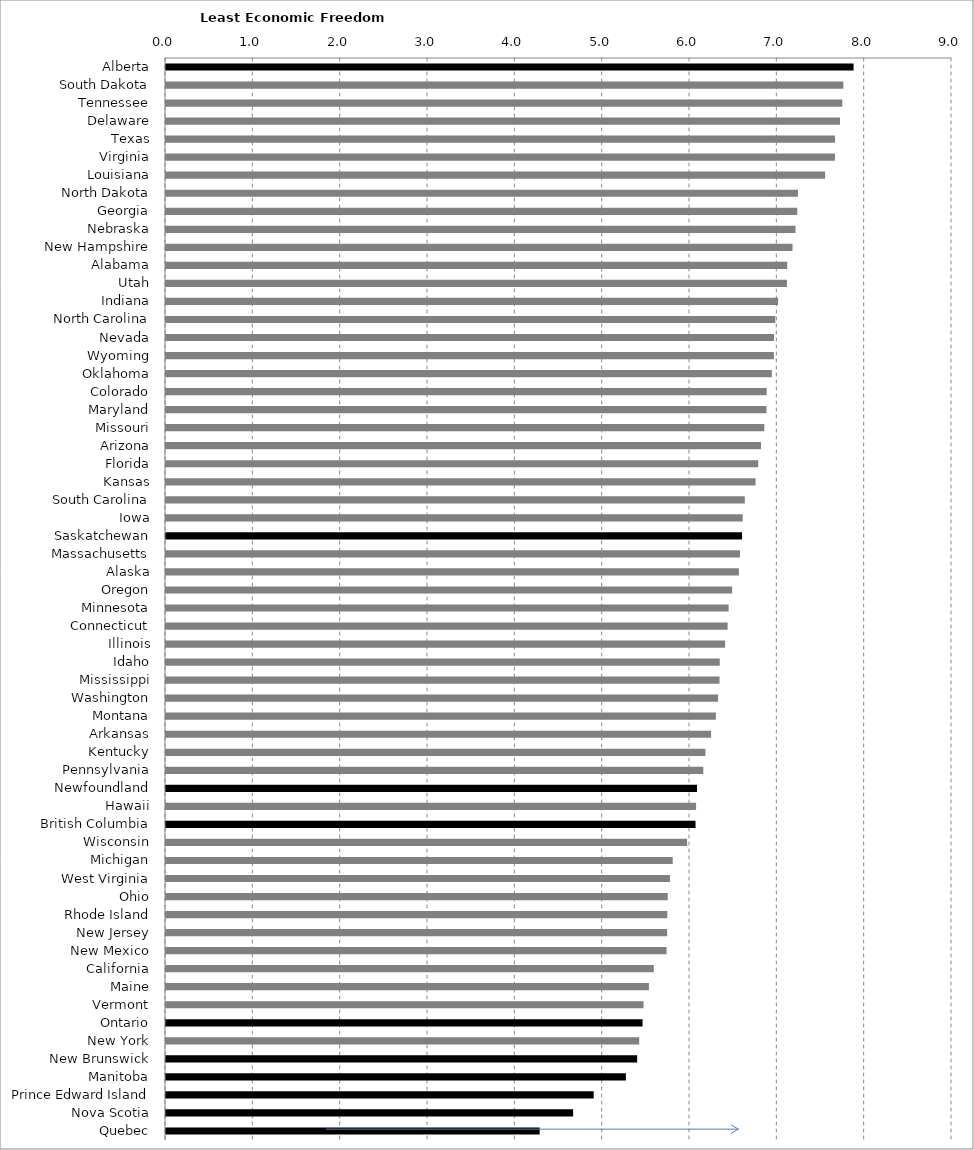
| Category | Series 0 |
|---|---|
| Alberta | 7.873 |
| South Dakota | 7.756 |
| Tennessee | 7.744 |
| Delaware | 7.717 |
| Texas | 7.661 |
| Virginia | 7.66 |
| Louisiana | 7.547 |
| North Dakota | 7.236 |
| Georgia | 7.228 |
| Nebraska | 7.208 |
| New Hampshire | 7.174 |
| Alabama | 7.113 |
| Utah | 7.11 |
| Indiana | 7.009 |
| North Carolina | 6.976 |
| Nevada | 6.962 |
| Wyoming | 6.96 |
| Oklahoma | 6.937 |
| Colorado | 6.878 |
| Maryland | 6.875 |
| Missouri | 6.851 |
| Arizona | 6.813 |
| Florida | 6.781 |
| Kansas | 6.751 |
| South Carolina | 6.628 |
| Iowa | 6.603 |
| Saskatchewan | 6.596 |
| Massachusetts | 6.572 |
| Alaska | 6.56 |
| Oregon | 6.483 |
| Minnesota | 6.442 |
| Connecticut | 6.431 |
| Illinois | 6.402 |
| Idaho | 6.341 |
| Mississippi | 6.338 |
| Washington | 6.322 |
| Montana | 6.296 |
| Arkansas | 6.241 |
| Kentucky | 6.176 |
| Pennsylvania | 6.152 |
| Newfoundland | 6.081 |
| Hawaii | 6.07 |
| British Columbia | 6.063 |
| Wisconsin | 5.967 |
| Michigan | 5.802 |
| West Virginia | 5.77 |
| Ohio | 5.745 |
| Rhode Island | 5.74 |
| New Jersey | 5.738 |
| New Mexico | 5.732 |
| California | 5.585 |
| Maine | 5.53 |
| Vermont | 5.468 |
| Ontario | 5.457 |
| New York | 5.419 |
| New Brunswick | 5.395 |
| Manitoba | 5.266 |
| Prince Edward Island | 4.897 |
| Nova Scotia | 4.662 |
| Quebec | 4.278 |